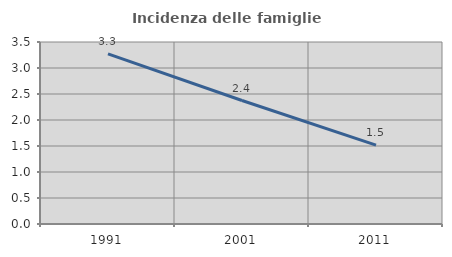
| Category | Incidenza delle famiglie numerose |
|---|---|
| 1991.0 | 3.27 |
| 2001.0 | 2.374 |
| 2011.0 | 1.518 |